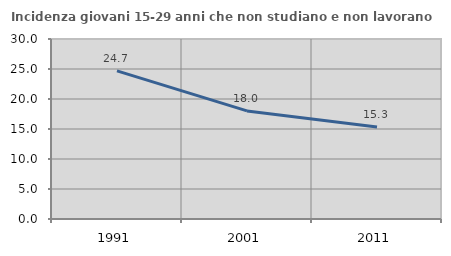
| Category | Incidenza giovani 15-29 anni che non studiano e non lavorano  |
|---|---|
| 1991.0 | 24.688 |
| 2001.0 | 18.011 |
| 2011.0 | 15.349 |